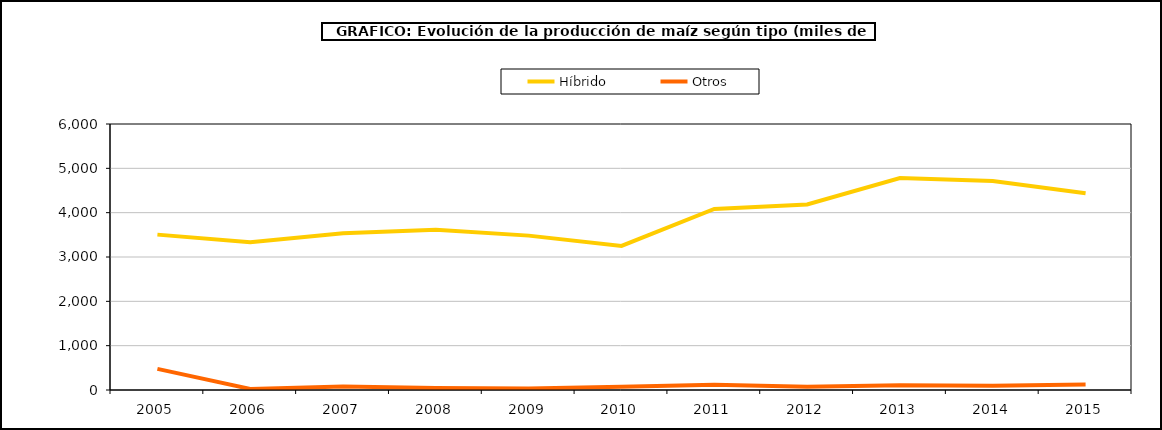
| Category | Híbrido | Otros |
|---|---|---|
| 2005 | 3504.679 | 476.691 |
| 2006 | 3332.474 | 23.248 |
| 2007 | 3534.026 | 76.911 |
| 2008 | 3615.117 | 45.316 |
| 2009 | 3482.098 | 33.519 |
| 2010 | 3250.084 | 74.737 |
| 2011 | 4084.167 | 115.76 |
| 2012 | 4186.073 | 75.996 |
| 2013 | 4779.482 | 108.979 |
| 2014 | 4715.168 | 95.477 |
| 2015 | 4439.372 | 125.044 |